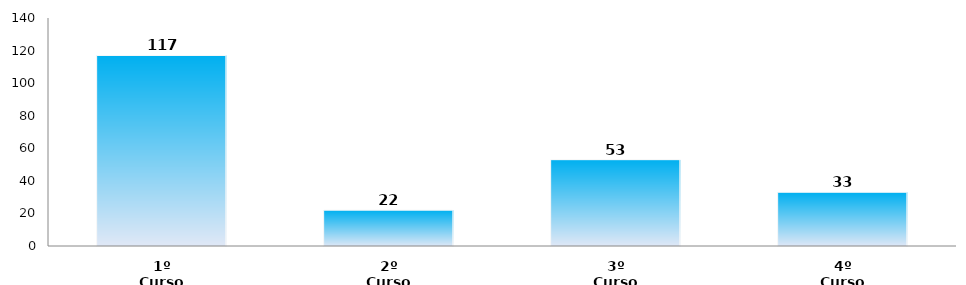
| Category | Series 0 |
|---|---|
| 1º Curso | 117 |
| 2º Curso | 22 |
| 3º Curso | 53 |
| 4º Curso | 33 |